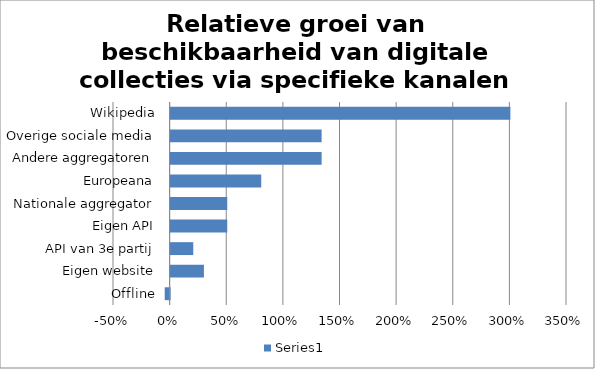
| Category | Series 0 |
|---|---|
| Offline | -0.043 |
| Eigen website | 0.294 |
| API van 3e partij | 0.2 |
| Eigen API | 0.5 |
| Nationale aggregator | 0.5 |
| Europeana | 0.8 |
| Andere aggregatoren | 1.333 |
| Overige sociale media | 1.333 |
| Wikipedia | 3 |